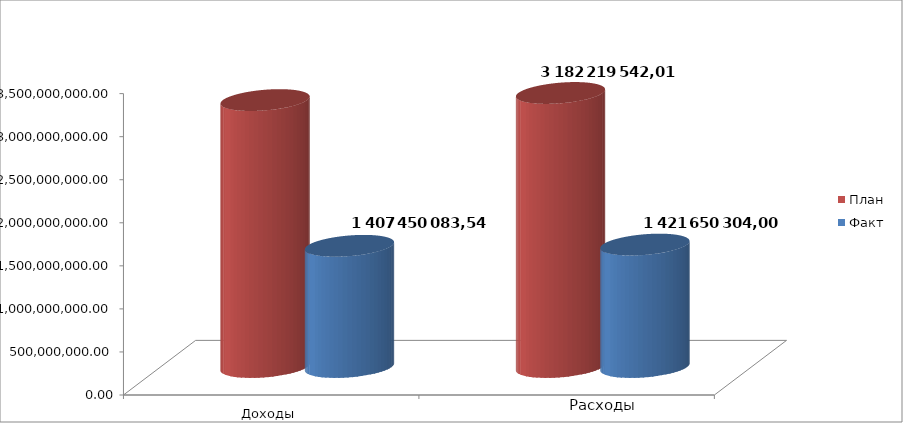
| Category | План | Факт |
|---|---|---|
| 0 | 3099886523.13 | 1407450083.54 |
| 1 | 3182219542.01 | 1421650304 |